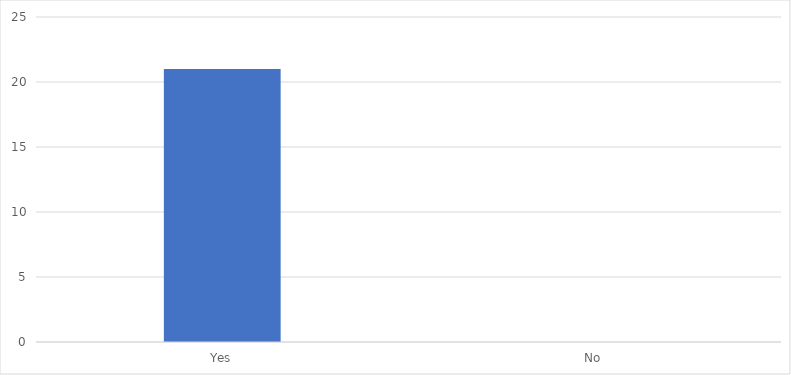
| Category | Number of Responses |
|---|---|
| Yes | 21 |
| No | 0 |